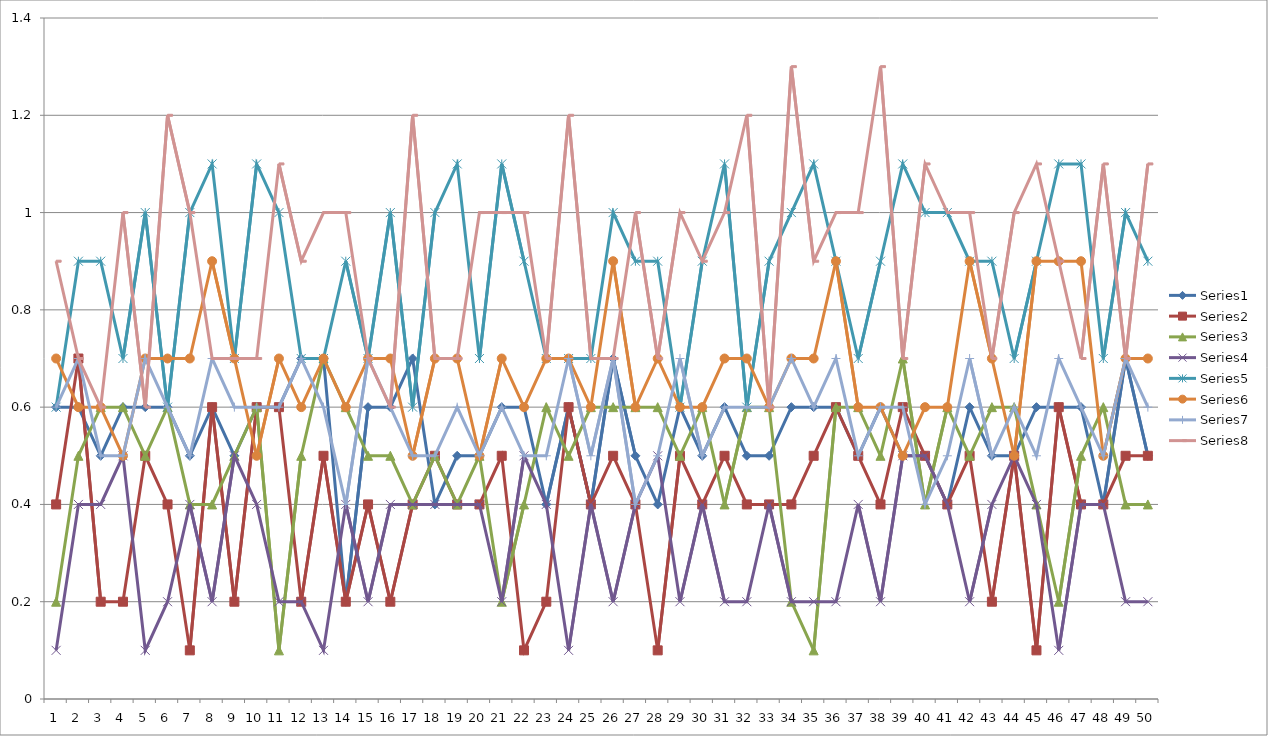
| Category | Series 0 | Series 1 | Series 2 | Series 3 | Series 4 | Series 5 | Series 6 | Series 7 |
|---|---|---|---|---|---|---|---|---|
| 0 | 0.6 | 0.4 | 0.2 | 0.1 | 0.6 | 0.7 | 0.6 | 0.9 |
| 1 | 0.6 | 0.7 | 0.5 | 0.4 | 0.9 | 0.6 | 0.7 | 0.7 |
| 2 | 0.5 | 0.2 | 0.6 | 0.4 | 0.9 | 0.6 | 0.5 | 0.6 |
| 3 | 0.6 | 0.2 | 0.6 | 0.5 | 0.7 | 0.5 | 0.5 | 1 |
| 4 | 0.6 | 0.5 | 0.5 | 0.1 | 1 | 0.7 | 0.7 | 0.6 |
| 5 | 0.6 | 0.4 | 0.6 | 0.2 | 0.6 | 0.7 | 0.6 | 1.2 |
| 6 | 0.5 | 0.1 | 0.4 | 0.4 | 1 | 0.7 | 0.5 | 1 |
| 7 | 0.6 | 0.6 | 0.4 | 0.2 | 1.1 | 0.9 | 0.7 | 0.7 |
| 8 | 0.5 | 0.2 | 0.5 | 0.5 | 0.7 | 0.7 | 0.6 | 0.7 |
| 9 | 0.6 | 0.6 | 0.6 | 0.4 | 1.1 | 0.5 | 0.6 | 0.7 |
| 10 | 0.6 | 0.6 | 0.1 | 0.2 | 1 | 0.7 | 0.6 | 1.1 |
| 11 | 0.7 | 0.2 | 0.5 | 0.2 | 0.7 | 0.6 | 0.7 | 0.9 |
| 12 | 0.7 | 0.5 | 0.7 | 0.1 | 0.7 | 0.7 | 0.6 | 1 |
| 13 | 0.2 | 0.2 | 0.6 | 0.4 | 0.9 | 0.6 | 0.4 | 1 |
| 14 | 0.6 | 0.4 | 0.5 | 0.2 | 0.7 | 0.7 | 0.7 | 0.7 |
| 15 | 0.6 | 0.2 | 0.5 | 0.4 | 1 | 0.7 | 0.6 | 0.6 |
| 16 | 0.7 | 0.4 | 0.4 | 0.4 | 0.6 | 0.5 | 0.5 | 1.2 |
| 17 | 0.4 | 0.5 | 0.5 | 0.4 | 1 | 0.7 | 0.5 | 0.7 |
| 18 | 0.5 | 0.4 | 0.4 | 0.4 | 1.1 | 0.7 | 0.6 | 0.7 |
| 19 | 0.5 | 0.4 | 0.5 | 0.4 | 0.7 | 0.5 | 0.5 | 1 |
| 20 | 0.6 | 0.5 | 0.2 | 0.2 | 1.1 | 0.7 | 0.6 | 1 |
| 21 | 0.6 | 0.1 | 0.4 | 0.5 | 0.9 | 0.6 | 0.5 | 1 |
| 22 | 0.4 | 0.2 | 0.6 | 0.4 | 0.7 | 0.7 | 0.5 | 0.7 |
| 23 | 0.6 | 0.6 | 0.5 | 0.1 | 0.7 | 0.7 | 0.7 | 1.2 |
| 24 | 0.4 | 0.4 | 0.6 | 0.4 | 0.7 | 0.6 | 0.5 | 0.7 |
| 25 | 0.7 | 0.5 | 0.6 | 0.2 | 1 | 0.9 | 0.7 | 0.7 |
| 26 | 0.5 | 0.4 | 0.6 | 0.4 | 0.9 | 0.6 | 0.4 | 1 |
| 27 | 0.4 | 0.1 | 0.6 | 0.5 | 0.9 | 0.7 | 0.5 | 0.7 |
| 28 | 0.6 | 0.5 | 0.5 | 0.2 | 0.6 | 0.6 | 0.7 | 1 |
| 29 | 0.5 | 0.4 | 0.6 | 0.4 | 0.9 | 0.6 | 0.5 | 0.9 |
| 30 | 0.6 | 0.5 | 0.4 | 0.2 | 1.1 | 0.7 | 0.6 | 1 |
| 31 | 0.5 | 0.4 | 0.6 | 0.2 | 0.6 | 0.7 | 0.6 | 1.2 |
| 32 | 0.5 | 0.4 | 0.6 | 0.4 | 0.9 | 0.6 | 0.6 | 0.6 |
| 33 | 0.6 | 0.4 | 0.2 | 0.2 | 1 | 0.7 | 0.7 | 1.3 |
| 34 | 0.6 | 0.5 | 0.1 | 0.2 | 1.1 | 0.7 | 0.6 | 0.9 |
| 35 | 0.6 | 0.6 | 0.6 | 0.2 | 0.9 | 0.9 | 0.7 | 1 |
| 36 | 0.5 | 0.5 | 0.6 | 0.4 | 0.7 | 0.6 | 0.5 | 1 |
| 37 | 0.6 | 0.4 | 0.5 | 0.2 | 0.9 | 0.6 | 0.6 | 1.3 |
| 38 | 0.5 | 0.6 | 0.7 | 0.5 | 1.1 | 0.5 | 0.6 | 0.7 |
| 39 | 0.5 | 0.5 | 0.4 | 0.5 | 1 | 0.6 | 0.4 | 1.1 |
| 40 | 0.4 | 0.4 | 0.6 | 0.4 | 1 | 0.6 | 0.5 | 1 |
| 41 | 0.6 | 0.5 | 0.5 | 0.2 | 0.9 | 0.9 | 0.7 | 1 |
| 42 | 0.5 | 0.2 | 0.6 | 0.4 | 0.9 | 0.7 | 0.5 | 0.7 |
| 43 | 0.5 | 0.5 | 0.6 | 0.5 | 0.7 | 0.5 | 0.6 | 1 |
| 44 | 0.6 | 0.1 | 0.4 | 0.4 | 0.9 | 0.9 | 0.5 | 1.1 |
| 45 | 0.6 | 0.6 | 0.2 | 0.1 | 1.1 | 0.9 | 0.7 | 0.9 |
| 46 | 0.6 | 0.4 | 0.5 | 0.4 | 1.1 | 0.9 | 0.6 | 0.7 |
| 47 | 0.4 | 0.4 | 0.6 | 0.4 | 0.7 | 0.5 | 0.5 | 1.1 |
| 48 | 0.7 | 0.5 | 0.4 | 0.2 | 1 | 0.7 | 0.7 | 0.7 |
| 49 | 0.5 | 0.5 | 0.4 | 0.2 | 0.9 | 0.7 | 0.6 | 1.1 |